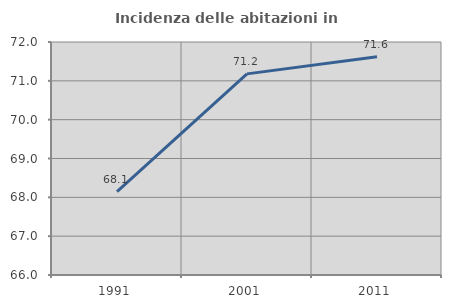
| Category | Incidenza delle abitazioni in proprietà  |
|---|---|
| 1991.0 | 68.144 |
| 2001.0 | 71.179 |
| 2011.0 | 71.622 |